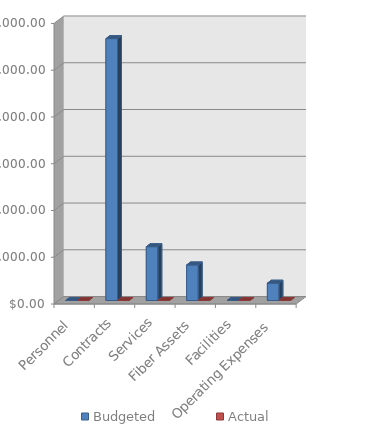
| Category | Budgeted | Actual |
|---|---|---|
| Personnel | 0 | 0 |
| Contracts | 56000 | 0 |
| Services | 11500 | 0 |
| Fiber Assets | 7600 | 0 |
| Facilities | 0 | 0 |
| Operating Expenses | 3700 | 0 |